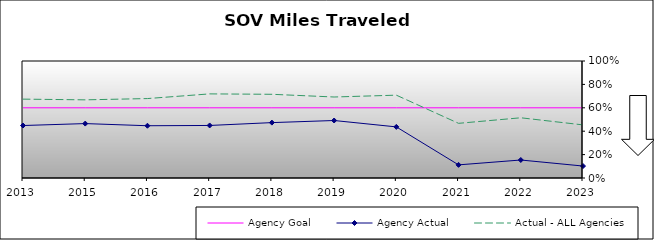
| Category | Agency Goal | Agency Actual | Actual - ALL Agencies |
|---|---|---|---|
| 2013.0 | 0.6 | 0.448 | 0.674 |
| 2015.0 | 0.6 | 0.465 | 0.668 |
| 2016.0 | 0.6 | 0.447 | 0.679 |
| 2017.0 | 0.6 | 0.449 | 0.719 |
| 2018.0 | 0.6 | 0.473 | 0.715 |
| 2019.0 | 0.6 | 0.491 | 0.692 |
| 2020.0 | 0.6 | 0.437 | 0.708 |
| 2021.0 | 0.6 | 0.112 | 0.467 |
| 2022.0 | 0.6 | 0.154 | 0.515 |
| 2023.0 | 0.6 | 0.102 | 0.454 |